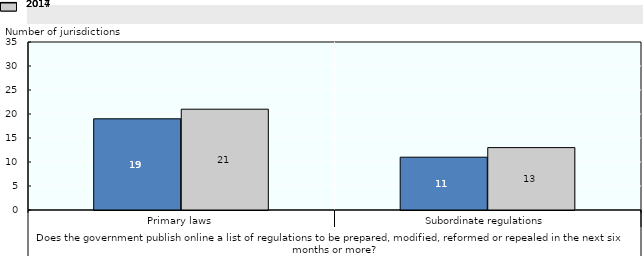
| Category | 2014 | 2017 |
|---|---|---|
| 0 | 19 | 21 |
| 1 | 11 | 13 |